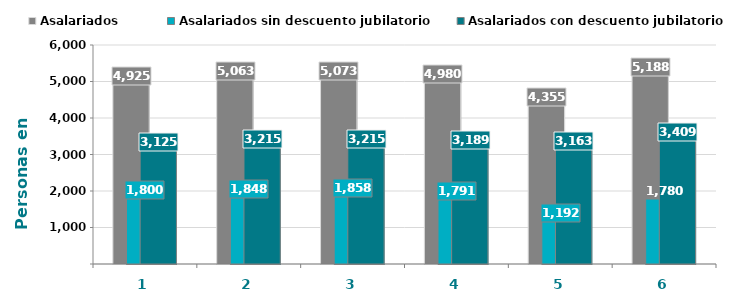
| Category | Asalariados | Asalariados sin descuento jubilatorio | Asalariados con descuento jubilatorio |
|---|---|---|---|
| 0 | 4925176 | 1800207 | 3124969 |
| 1 | 5062980 | 1847906 | 3215074 |
| 2 | 5072943 | 1858408 | 3214535 |
| 3 | 4979783 | 1791068 | 3188715 |
| 4 | 4355110 | 1191628 | 3163482 |
| 5 | 5188454 | 1779769 | 3408685 |